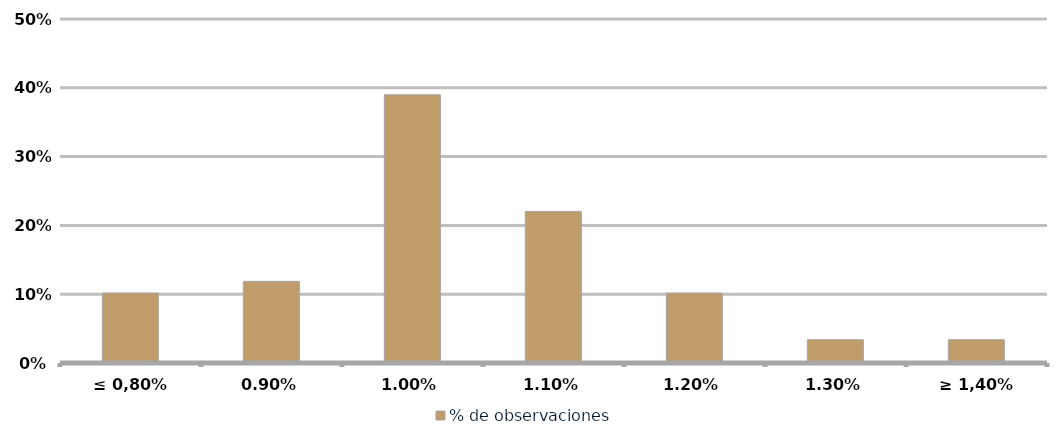
| Category | % de observaciones  |
|---|---|
| ≤ 0,80% | 0.102 |
| 0,90% | 0.119 |
| 1,00% | 0.39 |
| 1,10% | 0.22 |
| 1,20% | 0.102 |
| 1,30% | 0.034 |
| ≥ 1,40% | 0.034 |